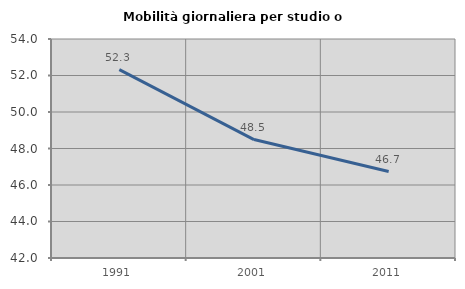
| Category | Mobilità giornaliera per studio o lavoro |
|---|---|
| 1991.0 | 52.32 |
| 2001.0 | 48.49 |
| 2011.0 | 46.738 |